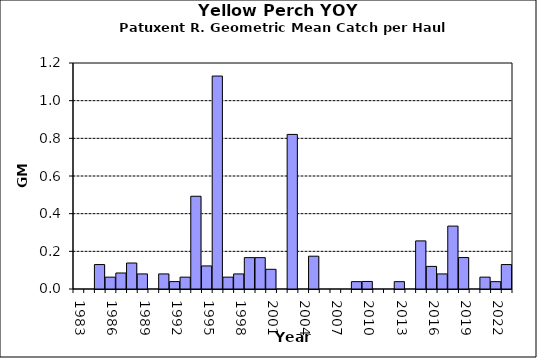
| Category | Series 0 |
|---|---|
| 1983.0 | 0 |
| 1984.0 | 0 |
| 1985.0 | 0.13 |
| 1986.0 | 0.063 |
| 1987.0 | 0.085 |
| 1988.0 | 0.138 |
| 1989.0 | 0.08 |
| 1990.0 | 0 |
| 1991.0 | 0.08 |
| 1992.0 | 0.039 |
| 1993.0 | 0.063 |
| 1994.0 | 0.492 |
| 1995.0 | 0.122 |
| 1996.0 | 1.131 |
| 1997.0 | 0.063 |
| 1998.0 | 0.08 |
| 1999.0 | 0.167 |
| 2000.0 | 0.167 |
| 2001.0 | 0.105 |
| 2002.0 | 0 |
| 2003.0 | 0.821 |
| 2004.0 | 0 |
| 2005.0 | 0.174 |
| 2006.0 | 0 |
| 2007.0 | 0 |
| 2008.0 | 0 |
| 2009.0 | 0.039 |
| 2010.0 | 0.04 |
| 2011.0 | 0 |
| 2012.0 | 0 |
| 2013.0 | 0.039 |
| 2014.0 | 0 |
| 2015.0 | 0.255 |
| 2016.0 | 0.12 |
| 2017.0 | 0.08 |
| 2018.0 | 0.334 |
| 2019.0 | 0.167 |
| 2020.0 | 0 |
| 2021.0 | 0.063 |
| 2022.0 | 0.039 |
| 2023.0 | 0.13 |